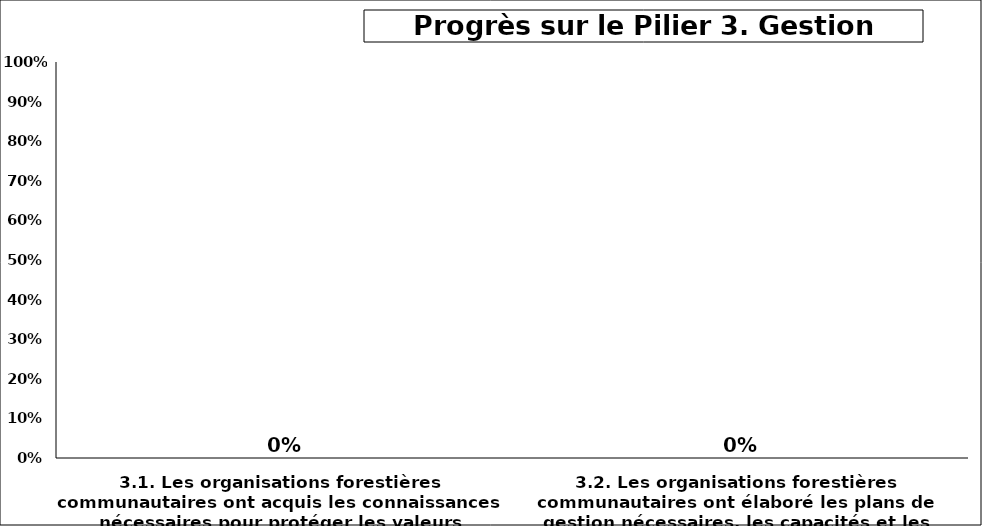
| Category | Series 6 |
|---|---|
| 3.1. Les organisations forestières communautaires ont acquis les connaissances nécessaires pour protéger les valeurs environnementales  | 0 |
| 3.2. Les organisations forestières communautaires ont élaboré les plans de gestion nécessaires, les capacités et les relations tenant compte de l’égalité des sexes pour gérer la forêt de manière durable  | 0 |